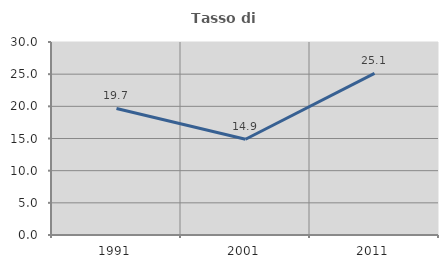
| Category | Tasso di occupazione   |
|---|---|
| 1991.0 | 19.669 |
| 2001.0 | 14.88 |
| 2011.0 | 25.131 |